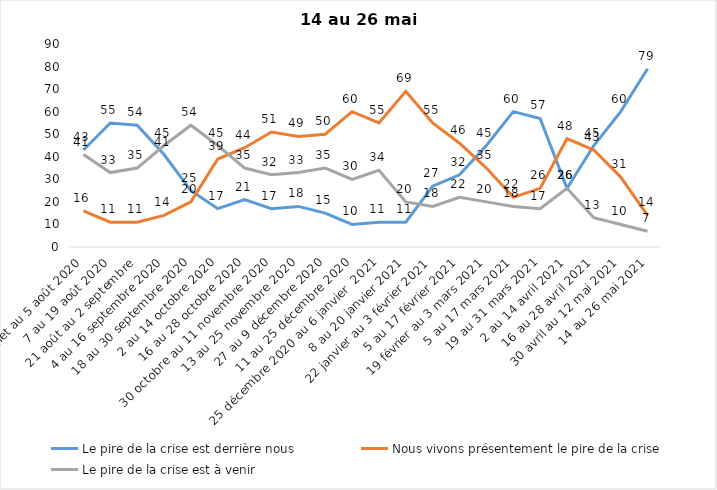
| Category | Le pire de la crise est derrière nous | Nous vivons présentement le pire de la crise | Le pire de la crise est à venir |
|---|---|---|---|
| 24 juillet au 5 août 2020 | 43 | 16 | 41 |
| 7 au 19 août 2020 | 55 | 11 | 33 |
| 21 août au 2 septembre | 54 | 11 | 35 |
| 4 au 16 septembre 2020 | 41 | 14 | 45 |
| 18 au 30 septembre 2020 | 25 | 20 | 54 |
| 2 au 14 octobre 2020 | 17 | 39 | 45 |
| 16 au 28 octobre 2020 | 21 | 44 | 35 |
| 30 octobre au 11 novembre 2020 | 17 | 51 | 32 |
| 13 au 25 novembre 2020 | 18 | 49 | 33 |
| 27 au 9 décembre 2020 | 15 | 50 | 35 |
| 11 au 25 décembre 2020 | 10 | 60 | 30 |
| 25 décembre 2020 au 6 janvier  2021 | 11 | 55 | 34 |
| 8 au 20 janvier 2021 | 11 | 69 | 20 |
| 22 janvier au 3 février 2021 | 27 | 55 | 18 |
| 5 au 17 février 2021 | 32 | 46 | 22 |
| 19 février au 3 mars 2021 | 45 | 35 | 20 |
| 5 au 17 mars 2021 | 60 | 22 | 18 |
| 19 au 31 mars 2021 | 57 | 26 | 17 |
| 2 au 14 avril 2021 | 26 | 48 | 26 |
| 16 au 28 avril 2021 | 45 | 43 | 13 |
| 30 avril au 12 mai 2021 | 60 | 31 | 10 |
| 14 au 26 mai 2021 | 79 | 14 | 7 |